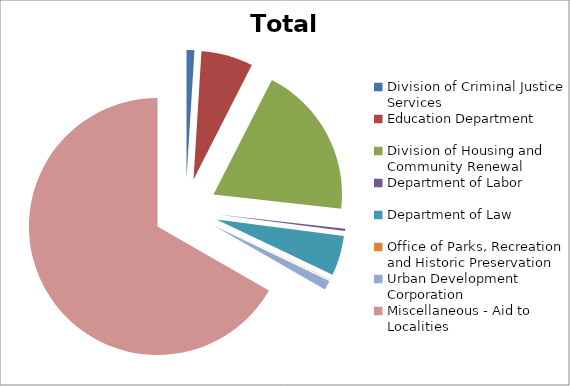
| Category | Series 0 |
|---|---|
| Division of Criminal Justice Services | 15989000 |
| Education Department | 105681000 |
| Division of Housing and Community Renewal | 312366643 |
| Department of Labor | 4355500 |
| Department of Law | 81500234 |
| Office of Parks, Recreation and Historic Preservation | 1000000 |
| Urban Development Corporation | 19000000 |
| Miscellaneous - Aid to Localities | 1081754736 |